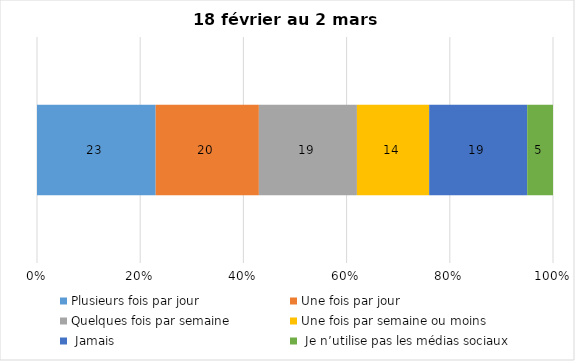
| Category | Plusieurs fois par jour | Une fois par jour | Quelques fois par semaine   | Une fois par semaine ou moins   |  Jamais   |  Je n’utilise pas les médias sociaux |
|---|---|---|---|---|---|---|
| 0 | 23 | 20 | 19 | 14 | 19 | 5 |